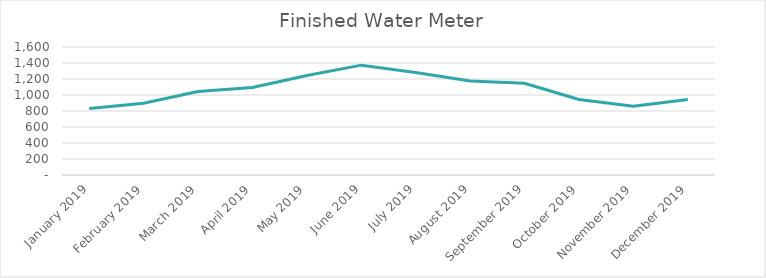
| Category | Series 0 |
|---|---|
| 2019-01-01 | 830.859 |
| 2019-02-01 | 897.135 |
| 2019-03-01 | 1043.538 |
| 2019-04-01 | 1093.556 |
| 2019-05-01 | 1244.372 |
| 2019-06-01 | 1373.169 |
| 2019-07-01 | 1280.913 |
| 2019-08-01 | 1175.144 |
| 2019-09-01 | 1147.208 |
| 2019-10-01 | 943.5 |
| 2019-11-01 | 858.34 |
| 2019-12-01 | 943.222 |